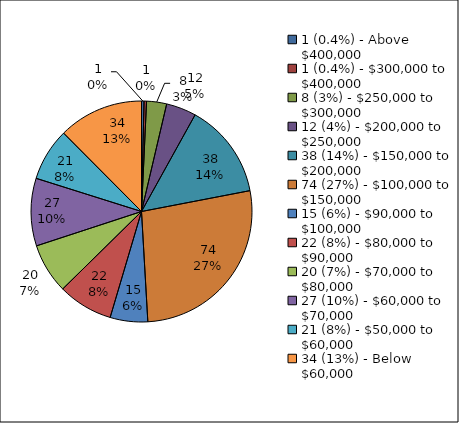
| Category | Series 0 |
|---|---|
| 1 (0.4%) - Above $400,000 | 1 |
| 1 (0.4%) - $300,000 to $400,000 | 1 |
| 8 (3%) - $250,000 to $300,000 | 8 |
| 12 (4%) - $200,000 to $250,000 | 12 |
| 38 (14%) - $150,000 to $200,000 | 38 |
| 74 (27%) - $100,000 to $150,000 | 74 |
| 15 (6%) - $90,000 to $100,000 | 15 |
| 22 (8%) - $80,000 to $90,000 | 22 |
| 20 (7%) - $70,000 to $80,000 | 20 |
| 27 (10%) - $60,000 to $70,000 | 27 |
| 21 (8%) - $50,000 to $60,000 | 21 |
| 34 (13%) - Below $60,000 | 34 |